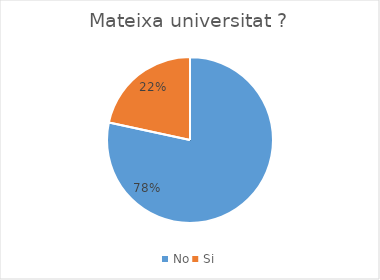
| Category | Series 0 |
|---|---|
| No | 29 |
| Si | 8 |